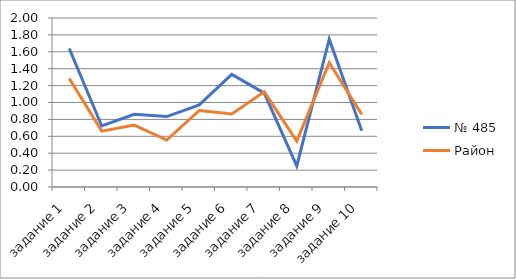
| Category | № 485 | Район |
|---|---|---|
| задание 1 | 1.639 | 1.284 |
| задание 2 | 0.722 | 0.661 |
| задание 3 | 0.861 | 0.733 |
| задание 4 | 0.833 | 0.555 |
| задание 5 | 0.972 | 0.906 |
| задание 6 | 1.333 | 0.865 |
| задание 7 | 1.111 | 1.127 |
| задание 8 | 0.25 | 0.543 |
| задание 9 | 1.75 | 1.472 |
| задание 10 | 0.667 | 0.859 |